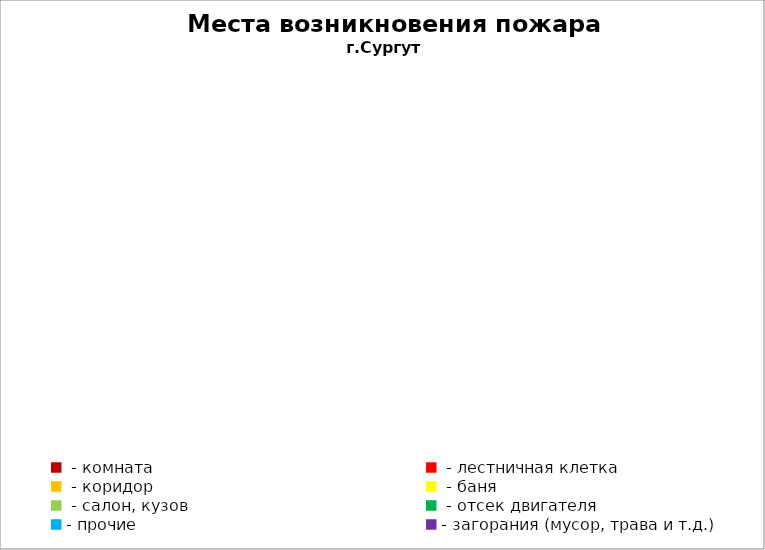
| Category | Места возникновения пожара |
|---|---|
|  - комната | 20 |
|  - лестничная клетка | 1 |
|  - коридор | 4 |
|  - баня | 9 |
|  - салон, кузов | 0 |
|  - отсек двигателя | 19 |
| - прочие | 25 |
| - загорания (мусор, трава и т.д.)  | 27 |